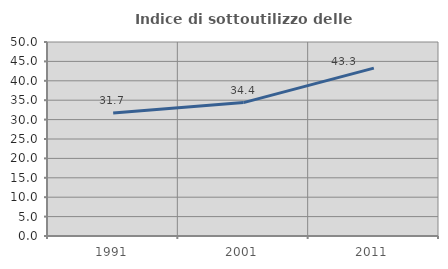
| Category | Indice di sottoutilizzo delle abitazioni  |
|---|---|
| 1991.0 | 31.673 |
| 2001.0 | 34.384 |
| 2011.0 | 43.257 |